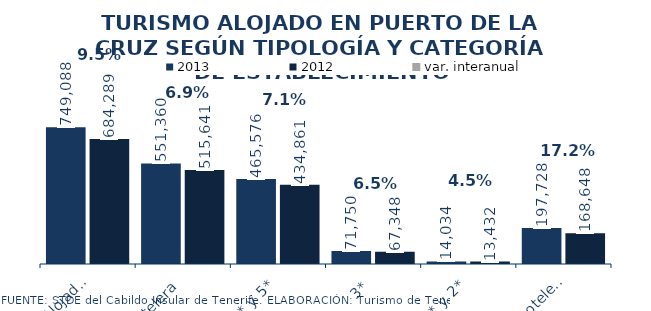
| Category | 2013 | 2012 |
|---|---|---|
| Total Alojados | 749088 | 684289 |
| Hotelera | 551360 | 515641 |
| 4* y 5* | 465576 | 434861 |
| 3* | 71750 | 67348 |
| 1* y 2* | 14034 | 13432 |
| Extrahotelera | 197728 | 168648 |